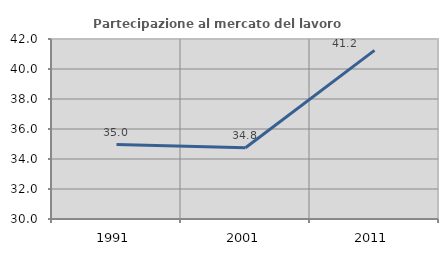
| Category | Partecipazione al mercato del lavoro  femminile |
|---|---|
| 1991.0 | 34.965 |
| 2001.0 | 34.754 |
| 2011.0 | 41.245 |